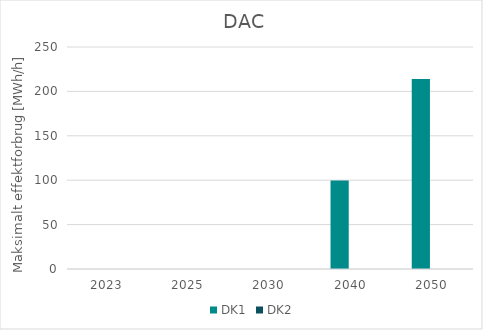
| Category | DK1 | DK2 |
|---|---|---|
| 2023.0 | 0 | 0 |
| 2025.0 | 0 | 0 |
| 2030.0 | 0 | 0 |
| 2040.0 | 99.613 | 0 |
| 2050.0 | 214.041 | 0 |